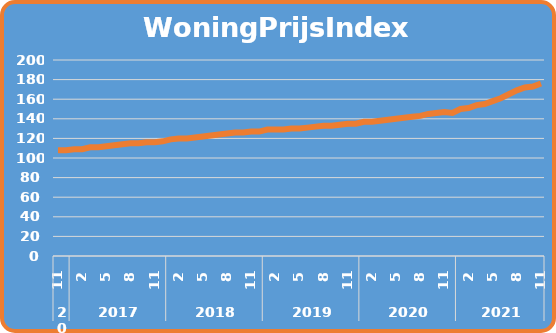
| Category | Totaal |
|---|---|
| 0 | 108 |
| 1 | 108 |
| 2 | 109 |
| 3 | 109 |
| 4 | 111 |
| 5 | 111 |
| 6 | 112 |
| 7 | 113 |
| 8 | 114 |
| 9 | 115 |
| 10 | 115 |
| 11 | 116 |
| 12 | 116 |
| 13 | 117 |
| 14 | 119 |
| 15 | 120 |
| 16 | 120 |
| 17 | 121 |
| 18 | 122 |
| 19 | 123 |
| 20 | 124 |
| 21 | 125 |
| 22 | 126 |
| 23 | 126 |
| 24 | 127 |
| 25 | 127 |
| 26 | 129 |
| 27 | 129 |
| 28 | 129 |
| 29 | 130 |
| 30 | 130 |
| 31 | 131 |
| 32 | 132 |
| 33 | 133 |
| 34 | 133 |
| 35 | 134 |
| 36 | 135 |
| 37 | 135 |
| 38 | 137 |
| 39 | 137 |
| 40 | 138 |
| 41 | 139 |
| 42 | 140 |
| 43 | 141 |
| 44 | 142 |
| 45 | 143 |
| 46 | 145 |
| 47 | 146 |
| 48 | 147 |
| 49 | 146 |
| 50 | 150 |
| 51 | 151 |
| 52 | 154 |
| 53 | 155 |
| 54 | 158 |
| 55 | 161 |
| 56 | 165 |
| 57 | 169 |
| 58 | 172 |
| 59 | 173 |
| 60 | 176 |